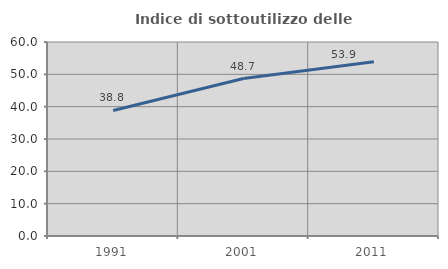
| Category | Indice di sottoutilizzo delle abitazioni  |
|---|---|
| 1991.0 | 38.826 |
| 2001.0 | 48.701 |
| 2011.0 | 53.912 |